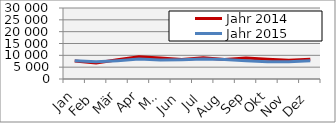
| Category | Jahr 2014 | Jahr 2015 |
|---|---|---|
| 0 | 7564.958 | 7697.736 |
| 1 | 6800.525 | 7253.891 |
| 2 | 8129.976 | 7760.622 |
| 3 | 9412.735 | 8400.465 |
| 4 | 8908.129 | 7981.872 |
| 5 | 8227.048 | 8107.882 |
| 6 | 8969.808 | 8423.51 |
| 7 | 8216.196 | 8246.32 |
| 8 | 8884.144 | 7682.223 |
| 9 | 8380.347 | 7299.089 |
| 10 | 7925.137 | 7330.761 |
| 11 | 8375.046 | 7691.146 |